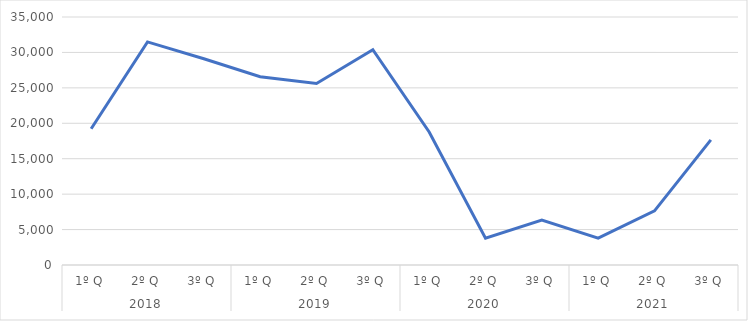
| Category | Series 0 |
|---|---|
| 0 | 19237 |
| 1 | 31481 |
| 2 | 29113 |
| 3 | 26567 |
| 4 | 25606 |
| 5 | 30379 |
| 6 | 18776 |
| 7 | 3790 |
| 8 | 6333 |
| 9 | 3796 |
| 10 | 7645 |
| 11 | 17666 |